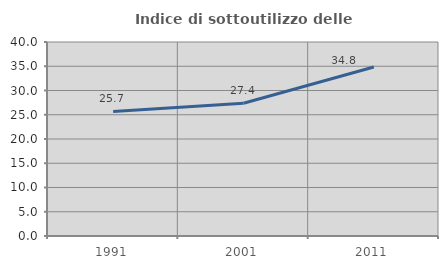
| Category | Indice di sottoutilizzo delle abitazioni  |
|---|---|
| 1991.0 | 25.693 |
| 2001.0 | 27.363 |
| 2011.0 | 34.837 |